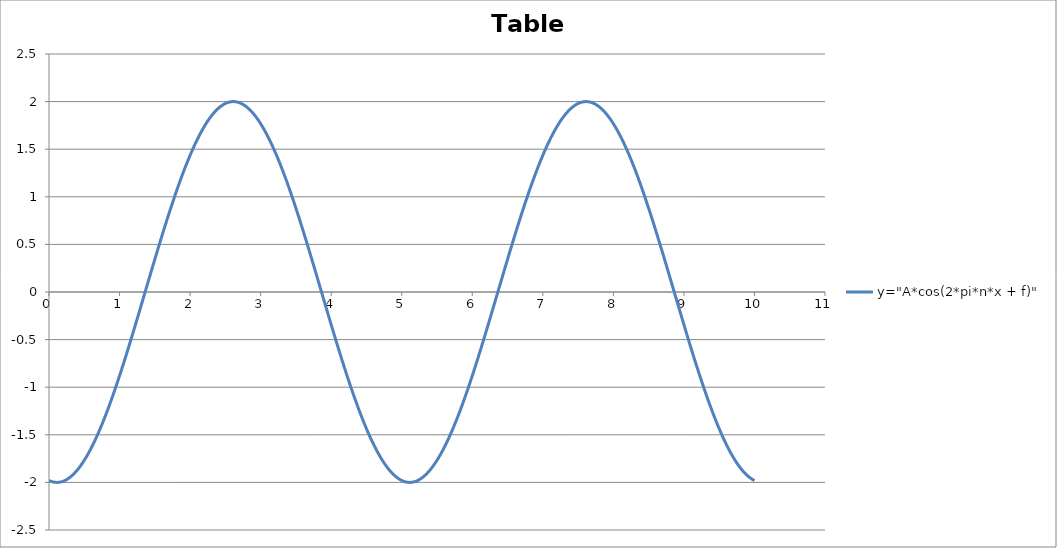
| Category | y="A*cos(2*pi*n*x + f)" |
|---|---|
| 0.0 | -1.98 |
| 0.01 | -1.983 |
| 0.02 | -1.986 |
| 0.03 | -1.989 |
| 0.04 | -1.992 |
| 0.05 | -1.994 |
| 0.060000000000000005 | -1.996 |
| 0.07 | -1.997 |
| 0.08 | -1.998 |
| 0.09 | -1.999 |
| 0.09999999999999999 | -2 |
| 0.10999999999999999 | -2 |
| 0.11999999999999998 | -2 |
| 0.12999999999999998 | -2 |
| 0.13999999999999999 | -1.999 |
| 0.15 | -1.998 |
| 0.16 | -1.996 |
| 0.17 | -1.995 |
| 0.18000000000000002 | -1.993 |
| 0.19000000000000003 | -1.991 |
| 0.20000000000000004 | -1.988 |
| 0.21000000000000005 | -1.985 |
| 0.22000000000000006 | -1.982 |
| 0.23000000000000007 | -1.978 |
| 0.24000000000000007 | -1.974 |
| 0.25000000000000006 | -1.97 |
| 0.26000000000000006 | -1.966 |
| 0.2700000000000001 | -1.961 |
| 0.2800000000000001 | -1.956 |
| 0.2900000000000001 | -1.951 |
| 0.3000000000000001 | -1.945 |
| 0.3100000000000001 | -1.939 |
| 0.3200000000000001 | -1.933 |
| 0.3300000000000001 | -1.926 |
| 0.34000000000000014 | -1.919 |
| 0.35000000000000014 | -1.912 |
| 0.36000000000000015 | -1.904 |
| 0.37000000000000016 | -1.896 |
| 0.38000000000000017 | -1.888 |
| 0.3900000000000002 | -1.88 |
| 0.4000000000000002 | -1.871 |
| 0.4100000000000002 | -1.862 |
| 0.4200000000000002 | -1.853 |
| 0.4300000000000002 | -1.843 |
| 0.4400000000000002 | -1.833 |
| 0.45000000000000023 | -1.823 |
| 0.46000000000000024 | -1.813 |
| 0.47000000000000025 | -1.802 |
| 0.48000000000000026 | -1.791 |
| 0.49000000000000027 | -1.779 |
| 0.5000000000000002 | -1.768 |
| 0.5100000000000002 | -1.756 |
| 0.5200000000000002 | -1.744 |
| 0.5300000000000002 | -1.731 |
| 0.5400000000000003 | -1.719 |
| 0.5500000000000003 | -1.706 |
| 0.5600000000000003 | -1.692 |
| 0.5700000000000003 | -1.679 |
| 0.5800000000000003 | -1.665 |
| 0.5900000000000003 | -1.651 |
| 0.6000000000000003 | -1.637 |
| 0.6100000000000003 | -1.622 |
| 0.6200000000000003 | -1.607 |
| 0.6300000000000003 | -1.592 |
| 0.6400000000000003 | -1.577 |
| 0.6500000000000004 | -1.561 |
| 0.6600000000000004 | -1.545 |
| 0.6700000000000004 | -1.529 |
| 0.6800000000000004 | -1.513 |
| 0.6900000000000004 | -1.496 |
| 0.7000000000000004 | -1.48 |
| 0.7100000000000004 | -1.463 |
| 0.7200000000000004 | -1.445 |
| 0.7300000000000004 | -1.428 |
| 0.7400000000000004 | -1.41 |
| 0.7500000000000004 | -1.392 |
| 0.7600000000000005 | -1.374 |
| 0.7700000000000005 | -1.356 |
| 0.7800000000000005 | -1.337 |
| 0.7900000000000005 | -1.318 |
| 0.8000000000000005 | -1.299 |
| 0.8100000000000005 | -1.28 |
| 0.8200000000000005 | -1.261 |
| 0.8300000000000005 | -1.241 |
| 0.8400000000000005 | -1.221 |
| 0.8500000000000005 | -1.201 |
| 0.8600000000000005 | -1.181 |
| 0.8700000000000006 | -1.161 |
| 0.8800000000000006 | -1.14 |
| 0.8900000000000006 | -1.119 |
| 0.9000000000000006 | -1.098 |
| 0.9100000000000006 | -1.077 |
| 0.9200000000000006 | -1.056 |
| 0.9300000000000006 | -1.035 |
| 0.9400000000000006 | -1.013 |
| 0.9500000000000006 | -0.991 |
| 0.9600000000000006 | -0.969 |
| 0.9700000000000006 | -0.947 |
| 0.9800000000000006 | -0.925 |
| 0.9900000000000007 | -0.903 |
| 1.0000000000000007 | -0.88 |
| 1.0100000000000007 | -0.858 |
| 1.0200000000000007 | -0.835 |
| 1.0300000000000007 | -0.812 |
| 1.0400000000000007 | -0.789 |
| 1.0500000000000007 | -0.766 |
| 1.0600000000000007 | -0.742 |
| 1.0700000000000007 | -0.719 |
| 1.0800000000000007 | -0.696 |
| 1.0900000000000007 | -0.672 |
| 1.1000000000000008 | -0.648 |
| 1.1100000000000008 | -0.624 |
| 1.1200000000000008 | -0.601 |
| 1.1300000000000008 | -0.576 |
| 1.1400000000000008 | -0.552 |
| 1.1500000000000008 | -0.528 |
| 1.1600000000000008 | -0.504 |
| 1.1700000000000008 | -0.48 |
| 1.1800000000000008 | -0.455 |
| 1.1900000000000008 | -0.431 |
| 1.2000000000000008 | -0.406 |
| 1.2100000000000009 | -0.381 |
| 1.2200000000000009 | -0.357 |
| 1.2300000000000009 | -0.332 |
| 1.2400000000000009 | -0.307 |
| 1.2500000000000009 | -0.282 |
| 1.260000000000001 | -0.257 |
| 1.270000000000001 | -0.232 |
| 1.280000000000001 | -0.207 |
| 1.290000000000001 | -0.182 |
| 1.300000000000001 | -0.157 |
| 1.310000000000001 | -0.132 |
| 1.320000000000001 | -0.107 |
| 1.330000000000001 | -0.082 |
| 1.340000000000001 | -0.057 |
| 1.350000000000001 | -0.032 |
| 1.360000000000001 | -0.007 |
| 1.370000000000001 | 0.018 |
| 1.380000000000001 | 0.044 |
| 1.390000000000001 | 0.069 |
| 1.400000000000001 | 0.094 |
| 1.410000000000001 | 0.119 |
| 1.420000000000001 | 0.144 |
| 1.430000000000001 | 0.169 |
| 1.440000000000001 | 0.194 |
| 1.450000000000001 | 0.219 |
| 1.460000000000001 | 0.244 |
| 1.470000000000001 | 0.269 |
| 1.480000000000001 | 0.294 |
| 1.490000000000001 | 0.319 |
| 1.500000000000001 | 0.343 |
| 1.5100000000000011 | 0.368 |
| 1.5200000000000011 | 0.393 |
| 1.5300000000000011 | 0.417 |
| 1.5400000000000011 | 0.442 |
| 1.5500000000000012 | 0.466 |
| 1.5600000000000012 | 0.491 |
| 1.5700000000000012 | 0.515 |
| 1.5800000000000012 | 0.539 |
| 1.5900000000000012 | 0.564 |
| 1.6000000000000012 | 0.588 |
| 1.6100000000000012 | 0.612 |
| 1.6200000000000012 | 0.636 |
| 1.6300000000000012 | 0.659 |
| 1.6400000000000012 | 0.683 |
| 1.6500000000000012 | 0.707 |
| 1.6600000000000013 | 0.73 |
| 1.6700000000000013 | 0.753 |
| 1.6800000000000013 | 0.777 |
| 1.6900000000000013 | 0.8 |
| 1.7000000000000013 | 0.823 |
| 1.7100000000000013 | 0.845 |
| 1.7200000000000013 | 0.868 |
| 1.7300000000000013 | 0.891 |
| 1.7400000000000013 | 0.913 |
| 1.7500000000000013 | 0.935 |
| 1.7600000000000013 | 0.958 |
| 1.7700000000000014 | 0.98 |
| 1.7800000000000014 | 1.001 |
| 1.7900000000000014 | 1.023 |
| 1.8000000000000014 | 1.045 |
| 1.8100000000000014 | 1.066 |
| 1.8200000000000014 | 1.087 |
| 1.8300000000000014 | 1.108 |
| 1.8400000000000014 | 1.129 |
| 1.8500000000000014 | 1.15 |
| 1.8600000000000014 | 1.17 |
| 1.8700000000000014 | 1.19 |
| 1.8800000000000014 | 1.211 |
| 1.8900000000000015 | 1.23 |
| 1.9000000000000015 | 1.25 |
| 1.9100000000000015 | 1.27 |
| 1.9200000000000015 | 1.289 |
| 1.9300000000000015 | 1.308 |
| 1.9400000000000015 | 1.327 |
| 1.9500000000000015 | 1.346 |
| 1.9600000000000015 | 1.364 |
| 1.9700000000000015 | 1.382 |
| 1.9800000000000015 | 1.401 |
| 1.9900000000000015 | 1.418 |
| 2.0000000000000013 | 1.436 |
| 2.010000000000001 | 1.453 |
| 2.020000000000001 | 1.47 |
| 2.0300000000000007 | 1.487 |
| 2.0400000000000005 | 1.504 |
| 2.0500000000000003 | 1.521 |
| 2.06 | 1.537 |
| 2.07 | 1.553 |
| 2.0799999999999996 | 1.568 |
| 2.0899999999999994 | 1.584 |
| 2.099999999999999 | 1.599 |
| 2.109999999999999 | 1.614 |
| 2.1199999999999988 | 1.629 |
| 2.1299999999999986 | 1.643 |
| 2.1399999999999983 | 1.657 |
| 2.149999999999998 | 1.671 |
| 2.159999999999998 | 1.685 |
| 2.1699999999999977 | 1.698 |
| 2.1799999999999975 | 1.712 |
| 2.1899999999999973 | 1.724 |
| 2.199999999999997 | 1.737 |
| 2.209999999999997 | 1.749 |
| 2.2199999999999966 | 1.761 |
| 2.2299999999999964 | 1.773 |
| 2.239999999999996 | 1.785 |
| 2.249999999999996 | 1.796 |
| 2.259999999999996 | 1.807 |
| 2.2699999999999956 | 1.817 |
| 2.2799999999999954 | 1.828 |
| 2.289999999999995 | 1.838 |
| 2.299999999999995 | 1.848 |
| 2.3099999999999947 | 1.857 |
| 2.3199999999999945 | 1.866 |
| 2.3299999999999943 | 1.875 |
| 2.339999999999994 | 1.884 |
| 2.349999999999994 | 1.892 |
| 2.3599999999999937 | 1.9 |
| 2.3699999999999934 | 1.908 |
| 2.3799999999999932 | 1.915 |
| 2.389999999999993 | 1.922 |
| 2.399999999999993 | 1.929 |
| 2.4099999999999926 | 1.935 |
| 2.4199999999999924 | 1.942 |
| 2.429999999999992 | 1.948 |
| 2.439999999999992 | 1.953 |
| 2.4499999999999917 | 1.958 |
| 2.4599999999999915 | 1.963 |
| 2.4699999999999913 | 1.968 |
| 2.479999999999991 | 1.972 |
| 2.489999999999991 | 1.976 |
| 2.4999999999999907 | 1.98 |
| 2.5099999999999905 | 1.983 |
| 2.5199999999999902 | 1.986 |
| 2.52999999999999 | 1.989 |
| 2.53999999999999 | 1.992 |
| 2.5499999999999896 | 1.994 |
| 2.5599999999999894 | 1.996 |
| 2.569999999999989 | 1.997 |
| 2.579999999999989 | 1.998 |
| 2.5899999999999888 | 1.999 |
| 2.5999999999999885 | 2 |
| 2.6099999999999883 | 2 |
| 2.619999999999988 | 2 |
| 2.629999999999988 | 2 |
| 2.6399999999999877 | 1.999 |
| 2.6499999999999875 | 1.998 |
| 2.6599999999999873 | 1.996 |
| 2.669999999999987 | 1.995 |
| 2.679999999999987 | 1.993 |
| 2.6899999999999866 | 1.991 |
| 2.6999999999999864 | 1.988 |
| 2.709999999999986 | 1.985 |
| 2.719999999999986 | 1.982 |
| 2.7299999999999858 | 1.978 |
| 2.7399999999999856 | 1.974 |
| 2.7499999999999853 | 1.97 |
| 2.759999999999985 | 1.966 |
| 2.769999999999985 | 1.961 |
| 2.7799999999999847 | 1.956 |
| 2.7899999999999845 | 1.951 |
| 2.7999999999999843 | 1.945 |
| 2.809999999999984 | 1.939 |
| 2.819999999999984 | 1.933 |
| 2.8299999999999836 | 1.926 |
| 2.8399999999999834 | 1.919 |
| 2.849999999999983 | 1.912 |
| 2.859999999999983 | 1.904 |
| 2.869999999999983 | 1.896 |
| 2.8799999999999826 | 1.888 |
| 2.8899999999999824 | 1.88 |
| 2.899999999999982 | 1.871 |
| 2.909999999999982 | 1.862 |
| 2.9199999999999817 | 1.853 |
| 2.9299999999999815 | 1.843 |
| 2.9399999999999813 | 1.833 |
| 2.949999999999981 | 1.823 |
| 2.959999999999981 | 1.813 |
| 2.9699999999999807 | 1.802 |
| 2.9799999999999804 | 1.791 |
| 2.9899999999999802 | 1.779 |
| 2.99999999999998 | 1.768 |
| 3.00999999999998 | 1.756 |
| 3.0199999999999796 | 1.744 |
| 3.0299999999999794 | 1.731 |
| 3.039999999999979 | 1.719 |
| 3.049999999999979 | 1.706 |
| 3.0599999999999787 | 1.692 |
| 3.0699999999999785 | 1.679 |
| 3.0799999999999783 | 1.665 |
| 3.089999999999978 | 1.651 |
| 3.099999999999978 | 1.637 |
| 3.1099999999999777 | 1.622 |
| 3.1199999999999775 | 1.607 |
| 3.1299999999999772 | 1.592 |
| 3.139999999999977 | 1.577 |
| 3.149999999999977 | 1.561 |
| 3.1599999999999766 | 1.545 |
| 3.1699999999999764 | 1.529 |
| 3.179999999999976 | 1.513 |
| 3.189999999999976 | 1.496 |
| 3.1999999999999758 | 1.48 |
| 3.2099999999999755 | 1.463 |
| 3.2199999999999753 | 1.445 |
| 3.229999999999975 | 1.428 |
| 3.239999999999975 | 1.41 |
| 3.2499999999999747 | 1.392 |
| 3.2599999999999745 | 1.374 |
| 3.2699999999999743 | 1.356 |
| 3.279999999999974 | 1.337 |
| 3.289999999999974 | 1.318 |
| 3.2999999999999736 | 1.299 |
| 3.3099999999999734 | 1.28 |
| 3.319999999999973 | 1.261 |
| 3.329999999999973 | 1.241 |
| 3.3399999999999728 | 1.221 |
| 3.3499999999999726 | 1.201 |
| 3.3599999999999723 | 1.181 |
| 3.369999999999972 | 1.161 |
| 3.379999999999972 | 1.14 |
| 3.3899999999999717 | 1.119 |
| 3.3999999999999715 | 1.098 |
| 3.4099999999999713 | 1.077 |
| 3.419999999999971 | 1.056 |
| 3.429999999999971 | 1.035 |
| 3.4399999999999706 | 1.013 |
| 3.4499999999999704 | 0.991 |
| 3.45999999999997 | 0.969 |
| 3.46999999999997 | 0.947 |
| 3.47999999999997 | 0.925 |
| 3.4899999999999696 | 0.903 |
| 3.4999999999999694 | 0.88 |
| 3.509999999999969 | 0.858 |
| 3.519999999999969 | 0.835 |
| 3.5299999999999687 | 0.812 |
| 3.5399999999999685 | 0.789 |
| 3.5499999999999683 | 0.766 |
| 3.559999999999968 | 0.742 |
| 3.569999999999968 | 0.719 |
| 3.5799999999999677 | 0.696 |
| 3.5899999999999674 | 0.672 |
| 3.5999999999999672 | 0.648 |
| 3.609999999999967 | 0.624 |
| 3.619999999999967 | 0.601 |
| 3.6299999999999666 | 0.576 |
| 3.6399999999999664 | 0.552 |
| 3.649999999999966 | 0.528 |
| 3.659999999999966 | 0.504 |
| 3.6699999999999657 | 0.48 |
| 3.6799999999999655 | 0.455 |
| 3.6899999999999653 | 0.431 |
| 3.699999999999965 | 0.406 |
| 3.709999999999965 | 0.381 |
| 3.7199999999999647 | 0.357 |
| 3.7299999999999645 | 0.332 |
| 3.7399999999999642 | 0.307 |
| 3.749999999999964 | 0.282 |
| 3.759999999999964 | 0.257 |
| 3.7699999999999636 | 0.232 |
| 3.7799999999999634 | 0.207 |
| 3.789999999999963 | 0.182 |
| 3.799999999999963 | 0.157 |
| 3.8099999999999627 | 0.132 |
| 3.8199999999999625 | 0.107 |
| 3.8299999999999623 | 0.082 |
| 3.839999999999962 | 0.057 |
| 3.849999999999962 | 0.032 |
| 3.8599999999999617 | 0.007 |
| 3.8699999999999615 | -0.018 |
| 3.8799999999999613 | -0.044 |
| 3.889999999999961 | -0.069 |
| 3.899999999999961 | -0.094 |
| 3.9099999999999606 | -0.119 |
| 3.9199999999999604 | -0.144 |
| 3.92999999999996 | -0.169 |
| 3.93999999999996 | -0.194 |
| 3.9499999999999598 | -0.219 |
| 3.9599999999999596 | -0.244 |
| 3.9699999999999593 | -0.269 |
| 3.979999999999959 | -0.294 |
| 3.989999999999959 | -0.319 |
| 3.9999999999999587 | -0.343 |
| 4.009999999999959 | -0.368 |
| 4.019999999999959 | -0.393 |
| 4.0299999999999585 | -0.417 |
| 4.039999999999958 | -0.442 |
| 4.049999999999958 | -0.466 |
| 4.059999999999958 | -0.491 |
| 4.069999999999958 | -0.515 |
| 4.079999999999957 | -0.539 |
| 4.089999999999957 | -0.564 |
| 4.099999999999957 | -0.588 |
| 4.109999999999957 | -0.612 |
| 4.119999999999957 | -0.636 |
| 4.129999999999956 | -0.659 |
| 4.139999999999956 | -0.683 |
| 4.149999999999956 | -0.707 |
| 4.159999999999956 | -0.73 |
| 4.1699999999999555 | -0.753 |
| 4.179999999999955 | -0.777 |
| 4.189999999999955 | -0.8 |
| 4.199999999999955 | -0.823 |
| 4.209999999999955 | -0.845 |
| 4.2199999999999545 | -0.868 |
| 4.229999999999954 | -0.891 |
| 4.239999999999954 | -0.913 |
| 4.249999999999954 | -0.935 |
| 4.259999999999954 | -0.958 |
| 4.269999999999953 | -0.98 |
| 4.279999999999953 | -1.001 |
| 4.289999999999953 | -1.023 |
| 4.299999999999953 | -1.045 |
| 4.3099999999999525 | -1.066 |
| 4.319999999999952 | -1.087 |
| 4.329999999999952 | -1.108 |
| 4.339999999999952 | -1.129 |
| 4.349999999999952 | -1.15 |
| 4.3599999999999515 | -1.17 |
| 4.369999999999951 | -1.19 |
| 4.379999999999951 | -1.211 |
| 4.389999999999951 | -1.23 |
| 4.399999999999951 | -1.25 |
| 4.40999999999995 | -1.27 |
| 4.41999999999995 | -1.289 |
| 4.42999999999995 | -1.308 |
| 4.43999999999995 | -1.327 |
| 4.4499999999999496 | -1.346 |
| 4.459999999999949 | -1.364 |
| 4.469999999999949 | -1.382 |
| 4.479999999999949 | -1.401 |
| 4.489999999999949 | -1.418 |
| 4.4999999999999485 | -1.436 |
| 4.509999999999948 | -1.453 |
| 4.519999999999948 | -1.47 |
| 4.529999999999948 | -1.487 |
| 4.539999999999948 | -1.504 |
| 4.549999999999947 | -1.521 |
| 4.559999999999947 | -1.537 |
| 4.569999999999947 | -1.553 |
| 4.579999999999947 | -1.568 |
| 4.589999999999947 | -1.584 |
| 4.599999999999946 | -1.599 |
| 4.609999999999946 | -1.614 |
| 4.619999999999946 | -1.629 |
| 4.629999999999946 | -1.643 |
| 4.6399999999999455 | -1.657 |
| 4.649999999999945 | -1.671 |
| 4.659999999999945 | -1.685 |
| 4.669999999999945 | -1.698 |
| 4.679999999999945 | -1.712 |
| 4.689999999999944 | -1.724 |
| 4.699999999999944 | -1.737 |
| 4.709999999999944 | -1.749 |
| 4.719999999999944 | -1.761 |
| 4.729999999999944 | -1.773 |
| 4.739999999999943 | -1.785 |
| 4.749999999999943 | -1.796 |
| 4.759999999999943 | -1.807 |
| 4.769999999999943 | -1.817 |
| 4.7799999999999425 | -1.828 |
| 4.789999999999942 | -1.838 |
| 4.799999999999942 | -1.848 |
| 4.809999999999942 | -1.857 |
| 4.819999999999942 | -1.866 |
| 4.8299999999999415 | -1.875 |
| 4.839999999999941 | -1.884 |
| 4.849999999999941 | -1.892 |
| 4.859999999999941 | -1.9 |
| 4.869999999999941 | -1.908 |
| 4.87999999999994 | -1.915 |
| 4.88999999999994 | -1.922 |
| 4.89999999999994 | -1.929 |
| 4.90999999999994 | -1.935 |
| 4.9199999999999395 | -1.942 |
| 4.929999999999939 | -1.948 |
| 4.939999999999939 | -1.953 |
| 4.949999999999939 | -1.958 |
| 4.959999999999939 | -1.963 |
| 4.9699999999999385 | -1.968 |
| 4.979999999999938 | -1.972 |
| 4.989999999999938 | -1.976 |
| 4.999999999999938 | -1.98 |
| 5.009999999999938 | -1.983 |
| 5.019999999999937 | -1.986 |
| 5.029999999999937 | -1.989 |
| 5.039999999999937 | -1.992 |
| 5.049999999999937 | -1.994 |
| 5.0599999999999365 | -1.996 |
| 5.069999999999936 | -1.997 |
| 5.079999999999936 | -1.998 |
| 5.089999999999936 | -1.999 |
| 5.099999999999936 | -2 |
| 5.1099999999999355 | -2 |
| 5.119999999999935 | -2 |
| 5.129999999999935 | -2 |
| 5.139999999999935 | -1.999 |
| 5.149999999999935 | -1.998 |
| 5.159999999999934 | -1.996 |
| 5.169999999999934 | -1.995 |
| 5.179999999999934 | -1.993 |
| 5.189999999999934 | -1.991 |
| 5.199999999999934 | -1.988 |
| 5.209999999999933 | -1.985 |
| 5.219999999999933 | -1.982 |
| 5.229999999999933 | -1.978 |
| 5.239999999999933 | -1.974 |
| 5.2499999999999325 | -1.97 |
| 5.259999999999932 | -1.966 |
| 5.269999999999932 | -1.961 |
| 5.279999999999932 | -1.956 |
| 5.289999999999932 | -1.951 |
| 5.299999999999931 | -1.945 |
| 5.309999999999931 | -1.939 |
| 5.319999999999931 | -1.933 |
| 5.329999999999931 | -1.926 |
| 5.339999999999931 | -1.919 |
| 5.34999999999993 | -1.912 |
| 5.35999999999993 | -1.904 |
| 5.36999999999993 | -1.896 |
| 5.37999999999993 | -1.888 |
| 5.3899999999999295 | -1.88 |
| 5.399999999999929 | -1.871 |
| 5.409999999999929 | -1.862 |
| 5.419999999999929 | -1.853 |
| 5.429999999999929 | -1.843 |
| 5.4399999999999284 | -1.833 |
| 5.449999999999928 | -1.823 |
| 5.459999999999928 | -1.813 |
| 5.469999999999928 | -1.802 |
| 5.479999999999928 | -1.791 |
| 5.489999999999927 | -1.779 |
| 5.499999999999927 | -1.768 |
| 5.509999999999927 | -1.756 |
| 5.519999999999927 | -1.744 |
| 5.5299999999999265 | -1.731 |
| 5.539999999999926 | -1.719 |
| 5.549999999999926 | -1.706 |
| 5.559999999999926 | -1.692 |
| 5.569999999999926 | -1.679 |
| 5.5799999999999255 | -1.665 |
| 5.589999999999925 | -1.651 |
| 5.599999999999925 | -1.637 |
| 5.609999999999925 | -1.622 |
| 5.619999999999925 | -1.607 |
| 5.629999999999924 | -1.592 |
| 5.639999999999924 | -1.577 |
| 5.649999999999924 | -1.561 |
| 5.659999999999924 | -1.545 |
| 5.6699999999999235 | -1.529 |
| 5.679999999999923 | -1.513 |
| 5.689999999999923 | -1.496 |
| 5.699999999999923 | -1.48 |
| 5.709999999999923 | -1.463 |
| 5.7199999999999225 | -1.445 |
| 5.729999999999922 | -1.428 |
| 5.739999999999922 | -1.41 |
| 5.749999999999922 | -1.392 |
| 5.759999999999922 | -1.374 |
| 5.769999999999921 | -1.356 |
| 5.779999999999921 | -1.337 |
| 5.789999999999921 | -1.318 |
| 5.799999999999921 | -1.299 |
| 5.809999999999921 | -1.28 |
| 5.81999999999992 | -1.261 |
| 5.82999999999992 | -1.241 |
| 5.83999999999992 | -1.221 |
| 5.84999999999992 | -1.201 |
| 5.8599999999999195 | -1.181 |
| 5.869999999999919 | -1.161 |
| 5.879999999999919 | -1.14 |
| 5.889999999999919 | -1.119 |
| 5.899999999999919 | -1.098 |
| 5.909999999999918 | -1.077 |
| 5.919999999999918 | -1.056 |
| 5.929999999999918 | -1.035 |
| 5.939999999999918 | -1.013 |
| 5.949999999999918 | -0.991 |
| 5.959999999999917 | -0.969 |
| 5.969999999999917 | -0.947 |
| 5.979999999999917 | -0.925 |
| 5.989999999999917 | -0.903 |
| 5.9999999999999165 | -0.88 |
| 6.009999999999916 | -0.858 |
| 6.019999999999916 | -0.835 |
| 6.029999999999916 | -0.812 |
| 6.039999999999916 | -0.789 |
| 6.0499999999999154 | -0.766 |
| 6.059999999999915 | -0.742 |
| 6.069999999999915 | -0.719 |
| 6.079999999999915 | -0.696 |
| 6.089999999999915 | -0.672 |
| 6.099999999999914 | -0.648 |
| 6.109999999999914 | -0.624 |
| 6.119999999999914 | -0.601 |
| 6.129999999999914 | -0.576 |
| 6.1399999999999135 | -0.552 |
| 6.149999999999913 | -0.528 |
| 6.159999999999913 | -0.504 |
| 6.169999999999913 | -0.48 |
| 6.179999999999913 | -0.455 |
| 6.1899999999999125 | -0.431 |
| 6.199999999999912 | -0.406 |
| 6.209999999999912 | -0.381 |
| 6.219999999999912 | -0.357 |
| 6.229999999999912 | -0.332 |
| 6.239999999999911 | -0.307 |
| 6.249999999999911 | -0.282 |
| 6.259999999999911 | -0.257 |
| 6.269999999999911 | -0.232 |
| 6.2799999999999105 | -0.207 |
| 6.28999999999991 | -0.182 |
| 6.29999999999991 | -0.157 |
| 6.30999999999991 | -0.132 |
| 6.31999999999991 | -0.107 |
| 6.3299999999999095 | -0.082 |
| 6.339999999999909 | -0.057 |
| 6.349999999999909 | -0.032 |
| 6.359999999999909 | -0.007 |
| 6.369999999999909 | 0.018 |
| 6.379999999999908 | 0.044 |
| 6.389999999999908 | 0.069 |
| 6.399999999999908 | 0.094 |
| 6.409999999999908 | 0.119 |
| 6.419999999999908 | 0.144 |
| 6.429999999999907 | 0.169 |
| 6.439999999999907 | 0.194 |
| 6.449999999999907 | 0.219 |
| 6.459999999999907 | 0.244 |
| 6.4699999999999065 | 0.269 |
| 6.479999999999906 | 0.294 |
| 6.489999999999906 | 0.319 |
| 6.499999999999906 | 0.343 |
| 6.509999999999906 | 0.368 |
| 6.519999999999905 | 0.393 |
| 6.529999999999905 | 0.417 |
| 6.539999999999905 | 0.442 |
| 6.549999999999905 | 0.466 |
| 6.559999999999905 | 0.491 |
| 6.569999999999904 | 0.515 |
| 6.579999999999904 | 0.539 |
| 6.589999999999904 | 0.564 |
| 6.599999999999904 | 0.588 |
| 6.6099999999999035 | 0.612 |
| 6.619999999999903 | 0.636 |
| 6.629999999999903 | 0.659 |
| 6.639999999999903 | 0.683 |
| 6.649999999999903 | 0.707 |
| 6.659999999999902 | 0.73 |
| 6.669999999999902 | 0.753 |
| 6.679999999999902 | 0.777 |
| 6.689999999999902 | 0.8 |
| 6.699999999999902 | 0.823 |
| 6.709999999999901 | 0.845 |
| 6.719999999999901 | 0.868 |
| 6.729999999999901 | 0.891 |
| 6.739999999999901 | 0.913 |
| 6.7499999999999005 | 0.935 |
| 6.7599999999999 | 0.958 |
| 6.7699999999999 | 0.98 |
| 6.7799999999999 | 1.001 |
| 6.7899999999999 | 1.023 |
| 6.7999999999998995 | 1.045 |
| 6.809999999999899 | 1.066 |
| 6.819999999999899 | 1.087 |
| 6.829999999999899 | 1.108 |
| 6.839999999999899 | 1.129 |
| 6.849999999999898 | 1.15 |
| 6.859999999999898 | 1.17 |
| 6.869999999999898 | 1.19 |
| 6.879999999999898 | 1.211 |
| 6.8899999999998975 | 1.23 |
| 6.899999999999897 | 1.25 |
| 6.909999999999897 | 1.27 |
| 6.919999999999897 | 1.289 |
| 6.929999999999897 | 1.308 |
| 6.9399999999998965 | 1.327 |
| 6.949999999999896 | 1.346 |
| 6.959999999999896 | 1.364 |
| 6.969999999999896 | 1.382 |
| 6.979999999999896 | 1.401 |
| 6.989999999999895 | 1.418 |
| 6.999999999999895 | 1.436 |
| 7.009999999999895 | 1.453 |
| 7.019999999999895 | 1.47 |
| 7.0299999999998946 | 1.487 |
| 7.039999999999894 | 1.504 |
| 7.049999999999894 | 1.521 |
| 7.059999999999894 | 1.537 |
| 7.069999999999894 | 1.553 |
| 7.0799999999998935 | 1.568 |
| 7.089999999999893 | 1.584 |
| 7.099999999999893 | 1.599 |
| 7.109999999999893 | 1.614 |
| 7.119999999999893 | 1.629 |
| 7.129999999999892 | 1.643 |
| 7.139999999999892 | 1.657 |
| 7.149999999999892 | 1.671 |
| 7.159999999999892 | 1.685 |
| 7.169999999999892 | 1.698 |
| 7.179999999999891 | 1.712 |
| 7.189999999999891 | 1.724 |
| 7.199999999999891 | 1.737 |
| 7.209999999999891 | 1.749 |
| 7.2199999999998905 | 1.761 |
| 7.22999999999989 | 1.773 |
| 7.23999999999989 | 1.785 |
| 7.24999999999989 | 1.796 |
| 7.25999999999989 | 1.807 |
| 7.269999999999889 | 1.817 |
| 7.279999999999889 | 1.828 |
| 7.289999999999889 | 1.838 |
| 7.299999999999889 | 1.848 |
| 7.309999999999889 | 1.857 |
| 7.319999999999888 | 1.866 |
| 7.329999999999888 | 1.875 |
| 7.339999999999888 | 1.884 |
| 7.349999999999888 | 1.892 |
| 7.3599999999998875 | 1.9 |
| 7.369999999999887 | 1.908 |
| 7.379999999999887 | 1.915 |
| 7.389999999999887 | 1.922 |
| 7.399999999999887 | 1.929 |
| 7.4099999999998865 | 1.935 |
| 7.419999999999886 | 1.942 |
| 7.429999999999886 | 1.948 |
| 7.439999999999886 | 1.953 |
| 7.449999999999886 | 1.958 |
| 7.459999999999885 | 1.963 |
| 7.469999999999885 | 1.968 |
| 7.479999999999885 | 1.972 |
| 7.489999999999885 | 1.976 |
| 7.4999999999998845 | 1.98 |
| 7.509999999999884 | 1.983 |
| 7.519999999999884 | 1.986 |
| 7.529999999999884 | 1.989 |
| 7.539999999999884 | 1.992 |
| 7.5499999999998835 | 1.994 |
| 7.559999999999883 | 1.996 |
| 7.569999999999883 | 1.997 |
| 7.579999999999883 | 1.998 |
| 7.589999999999883 | 1.999 |
| 7.599999999999882 | 2 |
| 7.609999999999882 | 2 |
| 7.619999999999882 | 2 |
| 7.629999999999882 | 2 |
| 7.6399999999998816 | 1.999 |
| 7.649999999999881 | 1.998 |
| 7.659999999999881 | 1.996 |
| 7.669999999999881 | 1.995 |
| 7.679999999999881 | 1.993 |
| 7.6899999999998805 | 1.991 |
| 7.69999999999988 | 1.988 |
| 7.70999999999988 | 1.985 |
| 7.71999999999988 | 1.982 |
| 7.72999999999988 | 1.978 |
| 7.739999999999879 | 1.974 |
| 7.749999999999879 | 1.97 |
| 7.759999999999879 | 1.966 |
| 7.769999999999879 | 1.961 |
| 7.779999999999879 | 1.956 |
| 7.789999999999878 | 1.951 |
| 7.799999999999878 | 1.945 |
| 7.809999999999878 | 1.939 |
| 7.819999999999878 | 1.933 |
| 7.8299999999998775 | 1.926 |
| 7.839999999999877 | 1.919 |
| 7.849999999999877 | 1.912 |
| 7.859999999999877 | 1.904 |
| 7.869999999999877 | 1.896 |
| 7.879999999999876 | 1.888 |
| 7.889999999999876 | 1.88 |
| 7.899999999999876 | 1.871 |
| 7.909999999999876 | 1.862 |
| 7.919999999999876 | 1.853 |
| 7.929999999999875 | 1.843 |
| 7.939999999999875 | 1.833 |
| 7.949999999999875 | 1.823 |
| 7.959999999999875 | 1.813 |
| 7.9699999999998745 | 1.802 |
| 7.979999999999874 | 1.791 |
| 7.989999999999874 | 1.779 |
| 7.999999999999874 | 1.768 |
| 8.009999999999874 | 1.756 |
| 8.019999999999873 | 1.744 |
| 8.029999999999873 | 1.731 |
| 8.039999999999873 | 1.719 |
| 8.049999999999873 | 1.706 |
| 8.059999999999873 | 1.692 |
| 8.069999999999872 | 1.679 |
| 8.079999999999872 | 1.665 |
| 8.089999999999872 | 1.651 |
| 8.099999999999872 | 1.637 |
| 8.109999999999872 | 1.622 |
| 8.119999999999871 | 1.607 |
| 8.129999999999871 | 1.592 |
| 8.139999999999871 | 1.577 |
| 8.14999999999987 | 1.561 |
| 8.15999999999987 | 1.545 |
| 8.16999999999987 | 1.529 |
| 8.17999999999987 | 1.513 |
| 8.18999999999987 | 1.496 |
| 8.19999999999987 | 1.48 |
| 8.20999999999987 | 1.463 |
| 8.21999999999987 | 1.445 |
| 8.229999999999869 | 1.428 |
| 8.239999999999869 | 1.41 |
| 8.249999999999869 | 1.392 |
| 8.259999999999868 | 1.374 |
| 8.269999999999868 | 1.356 |
| 8.279999999999868 | 1.337 |
| 8.289999999999868 | 1.318 |
| 8.299999999999867 | 1.299 |
| 8.309999999999867 | 1.28 |
| 8.319999999999867 | 1.261 |
| 8.329999999999867 | 1.241 |
| 8.339999999999867 | 1.221 |
| 8.349999999999866 | 1.201 |
| 8.359999999999866 | 1.181 |
| 8.369999999999866 | 1.161 |
| 8.379999999999866 | 1.14 |
| 8.389999999999866 | 1.119 |
| 8.399999999999865 | 1.098 |
| 8.409999999999865 | 1.077 |
| 8.419999999999865 | 1.056 |
| 8.429999999999865 | 1.035 |
| 8.439999999999864 | 1.013 |
| 8.449999999999864 | 0.991 |
| 8.459999999999864 | 0.969 |
| 8.469999999999864 | 0.947 |
| 8.479999999999864 | 0.925 |
| 8.489999999999863 | 0.903 |
| 8.499999999999863 | 0.88 |
| 8.509999999999863 | 0.858 |
| 8.519999999999863 | 0.835 |
| 8.529999999999863 | 0.812 |
| 8.539999999999862 | 0.789 |
| 8.549999999999862 | 0.766 |
| 8.559999999999862 | 0.742 |
| 8.569999999999862 | 0.719 |
| 8.579999999999862 | 0.696 |
| 8.589999999999861 | 0.672 |
| 8.599999999999861 | 0.648 |
| 8.60999999999986 | 0.624 |
| 8.61999999999986 | 0.601 |
| 8.62999999999986 | 0.576 |
| 8.63999999999986 | 0.552 |
| 8.64999999999986 | 0.528 |
| 8.65999999999986 | 0.504 |
| 8.66999999999986 | 0.48 |
| 8.67999999999986 | 0.455 |
| 8.68999999999986 | 0.431 |
| 8.699999999999859 | 0.406 |
| 8.709999999999859 | 0.381 |
| 8.719999999999859 | 0.357 |
| 8.729999999999858 | 0.332 |
| 8.739999999999858 | 0.307 |
| 8.749999999999858 | 0.282 |
| 8.759999999999858 | 0.257 |
| 8.769999999999857 | 0.232 |
| 8.779999999999857 | 0.207 |
| 8.789999999999857 | 0.182 |
| 8.799999999999857 | 0.157 |
| 8.809999999999857 | 0.132 |
| 8.819999999999856 | 0.107 |
| 8.829999999999856 | 0.082 |
| 8.839999999999856 | 0.057 |
| 8.849999999999856 | 0.032 |
| 8.859999999999856 | 0.007 |
| 8.869999999999855 | -0.018 |
| 8.879999999999855 | -0.044 |
| 8.889999999999855 | -0.069 |
| 8.899999999999855 | -0.094 |
| 8.909999999999854 | -0.119 |
| 8.919999999999854 | -0.144 |
| 8.929999999999854 | -0.169 |
| 8.939999999999854 | -0.194 |
| 8.949999999999854 | -0.219 |
| 8.959999999999853 | -0.244 |
| 8.969999999999853 | -0.269 |
| 8.979999999999853 | -0.294 |
| 8.989999999999853 | -0.319 |
| 8.999999999999853 | -0.343 |
| 9.009999999999852 | -0.368 |
| 9.019999999999852 | -0.393 |
| 9.029999999999852 | -0.417 |
| 9.039999999999852 | -0.442 |
| 9.049999999999851 | -0.466 |
| 9.059999999999851 | -0.491 |
| 9.069999999999851 | -0.515 |
| 9.07999999999985 | -0.539 |
| 9.08999999999985 | -0.564 |
| 9.09999999999985 | -0.588 |
| 9.10999999999985 | -0.612 |
| 9.11999999999985 | -0.636 |
| 9.12999999999985 | -0.659 |
| 9.13999999999985 | -0.683 |
| 9.14999999999985 | -0.707 |
| 9.15999999999985 | -0.73 |
| 9.169999999999849 | -0.753 |
| 9.179999999999849 | -0.777 |
| 9.189999999999849 | -0.8 |
| 9.199999999999848 | -0.823 |
| 9.209999999999848 | -0.845 |
| 9.219999999999848 | -0.868 |
| 9.229999999999848 | -0.891 |
| 9.239999999999847 | -0.913 |
| 9.249999999999847 | -0.935 |
| 9.259999999999847 | -0.958 |
| 9.269999999999847 | -0.98 |
| 9.279999999999847 | -1.001 |
| 9.289999999999846 | -1.023 |
| 9.299999999999846 | -1.045 |
| 9.309999999999846 | -1.066 |
| 9.319999999999846 | -1.087 |
| 9.329999999999846 | -1.108 |
| 9.339999999999845 | -1.129 |
| 9.349999999999845 | -1.15 |
| 9.359999999999845 | -1.17 |
| 9.369999999999845 | -1.19 |
| 9.379999999999844 | -1.211 |
| 9.389999999999844 | -1.23 |
| 9.399999999999844 | -1.25 |
| 9.409999999999844 | -1.27 |
| 9.419999999999844 | -1.289 |
| 9.429999999999843 | -1.308 |
| 9.439999999999843 | -1.327 |
| 9.449999999999843 | -1.346 |
| 9.459999999999843 | -1.364 |
| 9.469999999999843 | -1.382 |
| 9.479999999999842 | -1.401 |
| 9.489999999999842 | -1.418 |
| 9.499999999999842 | -1.436 |
| 9.509999999999842 | -1.453 |
| 9.519999999999841 | -1.47 |
| 9.529999999999841 | -1.487 |
| 9.539999999999841 | -1.504 |
| 9.54999999999984 | -1.521 |
| 9.55999999999984 | -1.537 |
| 9.56999999999984 | -1.553 |
| 9.57999999999984 | -1.568 |
| 9.58999999999984 | -1.584 |
| 9.59999999999984 | -1.599 |
| 9.60999999999984 | -1.614 |
| 9.61999999999984 | -1.629 |
| 9.62999999999984 | -1.643 |
| 9.639999999999839 | -1.657 |
| 9.649999999999839 | -1.671 |
| 9.659999999999838 | -1.685 |
| 9.669999999999838 | -1.698 |
| 9.679999999999838 | -1.712 |
| 9.689999999999838 | -1.724 |
| 9.699999999999838 | -1.737 |
| 9.709999999999837 | -1.749 |
| 9.719999999999837 | -1.761 |
| 9.729999999999837 | -1.773 |
| 9.739999999999837 | -1.785 |
| 9.749999999999837 | -1.796 |
| 9.759999999999836 | -1.807 |
| 9.769999999999836 | -1.817 |
| 9.779999999999836 | -1.828 |
| 9.789999999999836 | -1.838 |
| 9.799999999999836 | -1.848 |
| 9.809999999999835 | -1.857 |
| 9.819999999999835 | -1.866 |
| 9.829999999999835 | -1.875 |
| 9.839999999999835 | -1.884 |
| 9.849999999999834 | -1.892 |
| 9.859999999999834 | -1.9 |
| 9.869999999999834 | -1.908 |
| 9.879999999999834 | -1.915 |
| 9.889999999999834 | -1.922 |
| 9.899999999999833 | -1.929 |
| 9.909999999999833 | -1.935 |
| 9.919999999999833 | -1.942 |
| 9.929999999999833 | -1.948 |
| 9.939999999999833 | -1.953 |
| 9.949999999999832 | -1.958 |
| 9.959999999999832 | -1.963 |
| 9.969999999999832 | -1.968 |
| 9.979999999999832 | -1.972 |
| 9.989999999999831 | -1.976 |
| 9.999999999999831 | -1.98 |